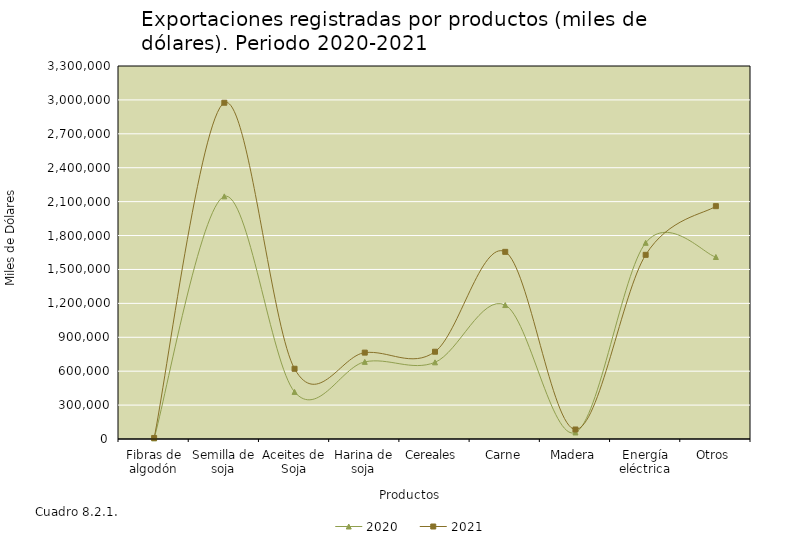
| Category | 2020 | 2021 |
|---|---|---|
| Fibras de algodón | 5130.493 | 9068.847 |
| Semilla de soja | 2146549.946 | 2975124.106 |
| Aceites de Soja | 416786.646 | 621353.654 |
| Harina de soja | 682342.431 | 764201.387 |
| Cereales | 678291.568 | 772103.943 |
| Carne | 1185104.13 | 1655761.084 |
| Madera | 57867.354 | 84056.064 |
| Energía eléctrica | 1735721.112 | 1629354.218 |
| Otros | 1610137.904 | 2059946.558 |